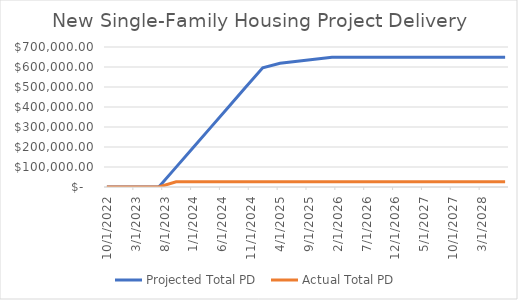
| Category | Projected Total PD  | Actual Total PD  |
|---|---|---|
| 10/1/22 | 0 | 0 |
| 1/1/23 | 0 | 0 |
| 4/1/23 | 0 | 0 |
| 7/1/23 | 0 | 0 |
| 10/1/23 | 99399.595 | 25742.5 |
| 1/1/24 | 198799.19 | 25742.5 |
| 4/1/24 | 298198.786 | 25742.5 |
| 7/1/24 | 397598.381 | 25742.5 |
| 10/1/24 | 496997.976 | 25742.5 |
| 1/1/25 | 596397.571 | 25742.5 |
| 4/1/25 | 618369 | 25742.5 |
| 7/1/25 | 628369 | 25742.5 |
| 10/1/25 | 638369 | 25742.5 |
| 1/1/26 | 648369 | 25742.5 |
| 4/1/26 | 648369 | 25742.5 |
| 7/1/26 | 648369 | 25742.5 |
| 10/1/26 | 648369 | 25742.5 |
| 1/1/27 | 648369 | 25742.5 |
| 4/1/27 | 648369 | 25742.5 |
| 7/1/27 | 648369 | 25742.5 |
| 10/1/27 | 648369 | 25742.5 |
| 1/1/28 | 648369 | 25742.5 |
| 4/1/28 | 648369 | 25742.5 |
| 7/1/28 | 648369 | 25742.5 |